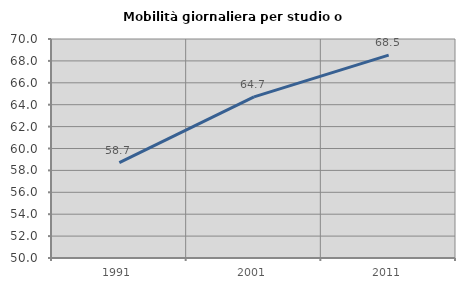
| Category | Mobilità giornaliera per studio o lavoro |
|---|---|
| 1991.0 | 58.717 |
| 2001.0 | 64.717 |
| 2011.0 | 68.527 |